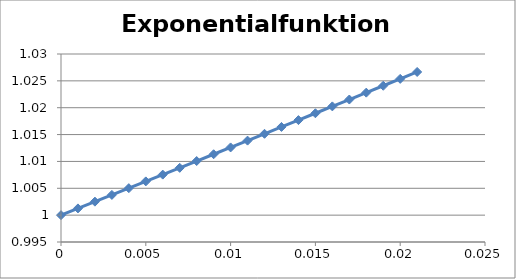
| Category | y |
|---|---|
| 0.0 | 1 |
| 0.001 | 1.001 |
| 0.002 | 1.003 |
| 0.003 | 1.004 |
| 0.004 | 1.005 |
| 0.005 | 1.006 |
| 0.006 | 1.008 |
| 0.007 | 1.009 |
| 0.008 | 1.01 |
| 0.009000000000000001 | 1.011 |
| 0.010000000000000002 | 1.013 |
| 0.011000000000000003 | 1.014 |
| 0.012000000000000004 | 1.015 |
| 0.013000000000000005 | 1.016 |
| 0.014000000000000005 | 1.018 |
| 0.015000000000000006 | 1.019 |
| 0.016000000000000007 | 1.02 |
| 0.017000000000000008 | 1.022 |
| 0.01800000000000001 | 1.023 |
| 0.01900000000000001 | 1.024 |
| 0.02000000000000001 | 1.025 |
| 0.02100000000000001 | 1.027 |